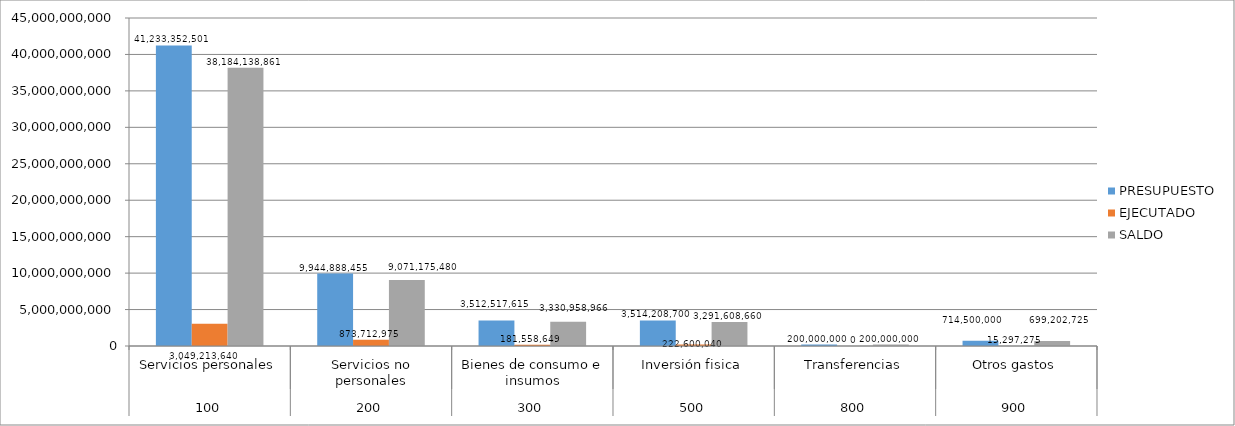
| Category | PRESUPUESTO | EJECUTADO | SALDO |
|---|---|---|---|
| 0 | 41233352501 | 3049213640 | 38184138861 |
| 1 | 9944888455 | 873712975 | 9071175480 |
| 2 | 3512517615 | 181558649 | 3330958966 |
| 3 | 3514208700 | 222600040 | 3291608660 |
| 4 | 200000000 | 0 | 200000000 |
| 5 | 714500000 | 15297275 | 699202725 |